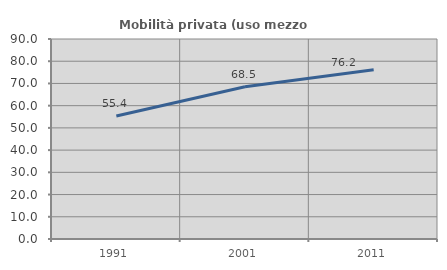
| Category | Mobilità privata (uso mezzo privato) |
|---|---|
| 1991.0 | 55.368 |
| 2001.0 | 68.504 |
| 2011.0 | 76.206 |